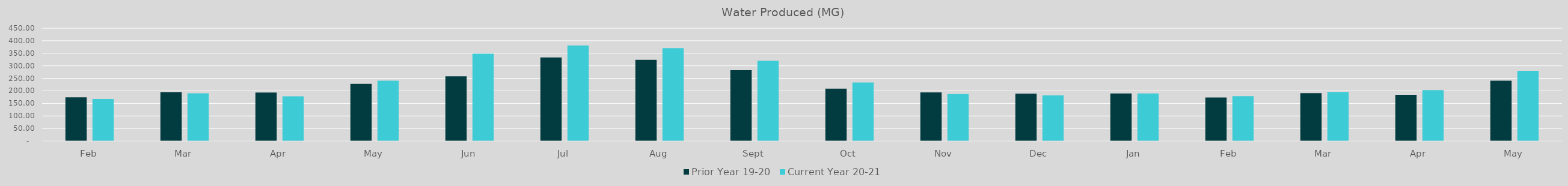
| Category | Prior Year 19-20  | Current Year 20-21 |
|---|---|---|
| Feb | 173.847 | 167.532 |
| Mar | 195.333 | 190.306 |
| Apr | 193.551 | 178.22 |
| May | 228.091 | 240.625 |
| Jun | 257.9 | 348.57 |
| Jul | 333.37 | 381.34 |
| Aug | 323.49 | 370.12 |
| Sep | 282.53 | 320.39 |
| Oct | 208.72 | 233.34 |
| Nov | 193.92 | 187.14 |
| Dec | 188.86 | 182.02 |
| Jan | 189.94 | 189.96 |
| Feb | 173.75 | 178.97 |
| Mar | 190.77 | 195.96 |
| Apr | 184.23 | 203.05 |
| May | 240.63 | 280.19 |